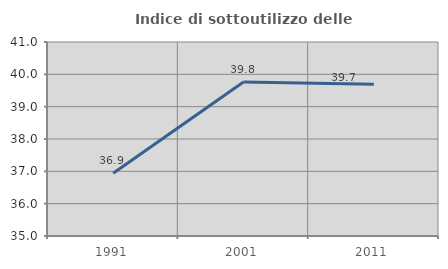
| Category | Indice di sottoutilizzo delle abitazioni  |
|---|---|
| 1991.0 | 36.943 |
| 2001.0 | 39.763 |
| 2011.0 | 39.695 |